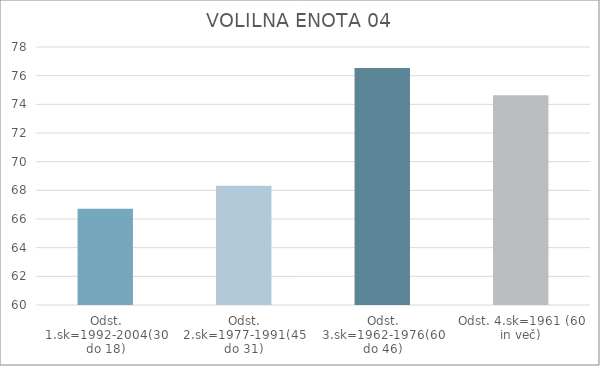
| Category | Series 0 |
|---|---|
| Odst. 1.sk=1992-2004(30 do 18) | 66.72 |
| Odst. 2.sk=1977-1991(45 do 31) | 68.32 |
| Odst. 3.sk=1962-1976(60 do 46) | 76.54 |
| Odst. 4.sk=1961 (60 in več) | 74.63 |